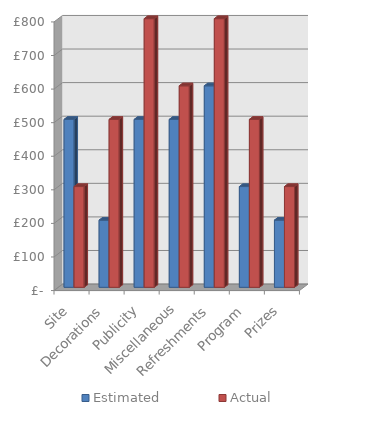
| Category | Estimated | Actual |
|---|---|---|
| Site | 500 | 300 |
| Decorations | 200 | 500 |
| Publicity | 500 | 800 |
| Miscellaneous | 500 | 600 |
| Refreshments | 600 | 800 |
| Program | 300 | 500 |
| Prizes | 200 | 300 |